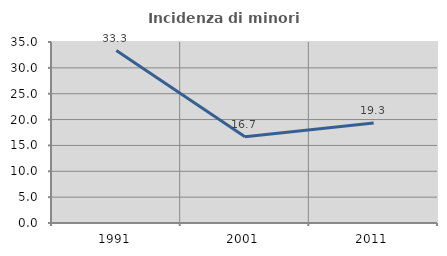
| Category | Incidenza di minori stranieri |
|---|---|
| 1991.0 | 33.333 |
| 2001.0 | 16.667 |
| 2011.0 | 19.34 |